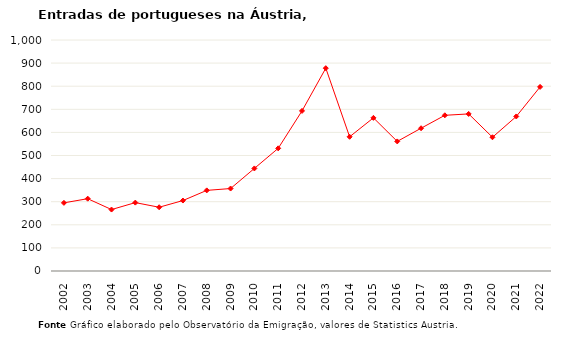
| Category | Entradas |
|---|---|
| 2002.0 | 295 |
| 2003.0 | 313 |
| 2004.0 | 266 |
| 2005.0 | 296 |
| 2006.0 | 276 |
| 2007.0 | 305 |
| 2008.0 | 349 |
| 2009.0 | 357 |
| 2010.0 | 444 |
| 2011.0 | 531 |
| 2012.0 | 693 |
| 2013.0 | 878 |
| 2014.0 | 581 |
| 2015.0 | 663 |
| 2016.0 | 561 |
| 2017.0 | 618 |
| 2018.0 | 674 |
| 2019.0 | 680 |
| 2020.0 | 579 |
| 2021.0 | 669 |
| 2022.0 | 797 |